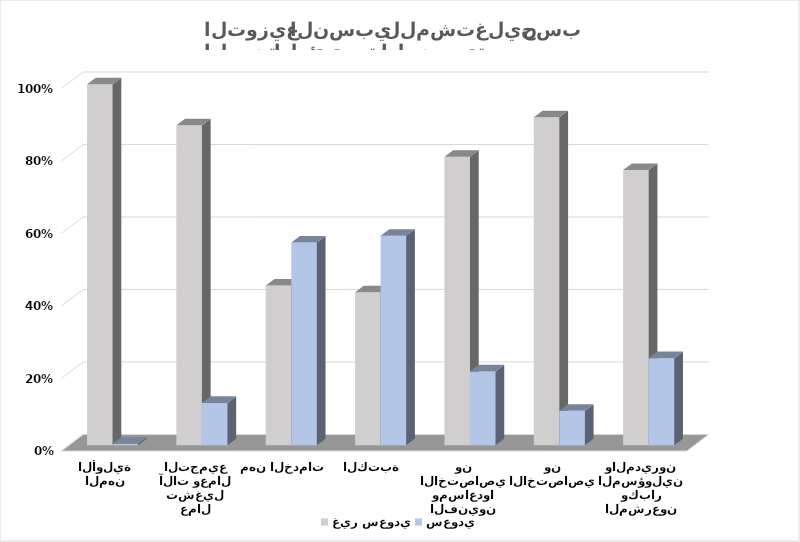
| Category | غير سعودي  | سعودي  |
|---|---|---|
| المشرعون وكبار المسؤولين والمديرون | 0.76 | 0.24 |
| الاختصاصيون | 0.905 | 0.095 |
| الفنيون ومساعدوا الاختصاصيون | 0.796 | 0.204 |
| الكتبة | 0.422 | 0.578 |
| مهن الخدمات | 0.441 | 0.559 |
| عمال تشغيل آلات وعمال التجميع | 0.883 | 0.117 |
| المهن الأولية | 0.996 | 0.004 |